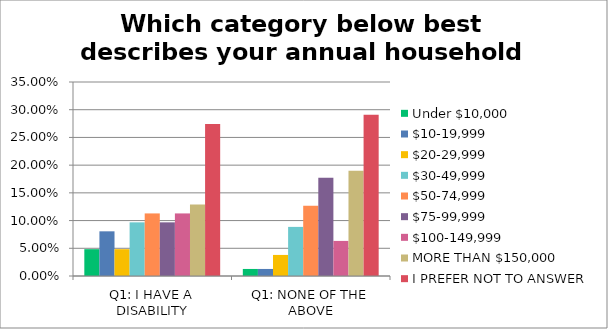
| Category | Under $10,000 | $10-19,999 | $20-29,999 | $30-49,999 | $50-74,999 | $75-99,999 | $100-149,999 | MORE THAN $150,000 | I PREFER NOT TO ANSWER |
|---|---|---|---|---|---|---|---|---|---|
| Q1: I HAVE A DISABILITY | 0.048 | 0.081 | 0.048 | 0.097 | 0.113 | 0.097 | 0.113 | 0.129 | 0.274 |
| Q1: NONE OF THE ABOVE | 0.013 | 0.013 | 0.038 | 0.089 | 0.127 | 0.177 | 0.063 | 0.19 | 0.291 |